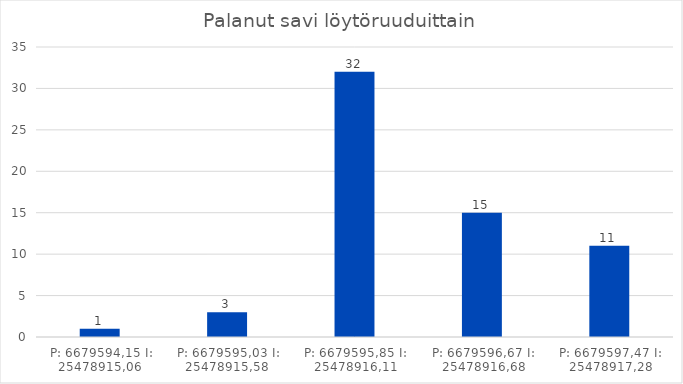
| Category | Kpl |
|---|---|
| P: 6679594,15 I: 25478915,06  | 1 |
| P: 6679595,03 I: 25478915,58  | 3 |
| P: 6679595,85 I: 25478916,11 | 32 |
| P: 6679596,67 I: 25478916,68 | 15 |
| P: 6679597,47 I: 25478917,28 | 11 |